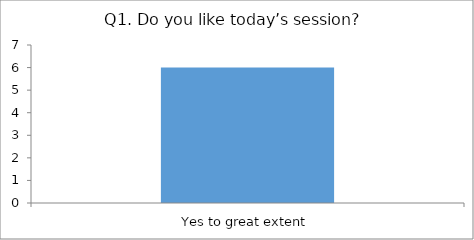
| Category | Q1. Do you like today’s session? |
|---|---|
| Yes to great extent | 6 |